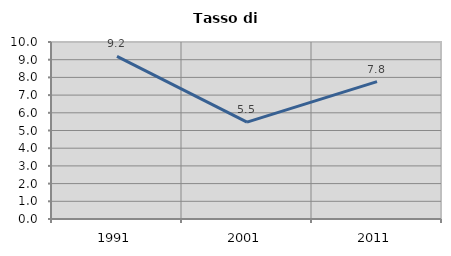
| Category | Tasso di disoccupazione   |
|---|---|
| 1991.0 | 9.187 |
| 2001.0 | 5.475 |
| 2011.0 | 7.761 |